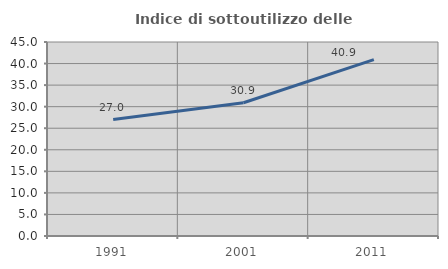
| Category | Indice di sottoutilizzo delle abitazioni  |
|---|---|
| 1991.0 | 27.018 |
| 2001.0 | 30.909 |
| 2011.0 | 40.896 |